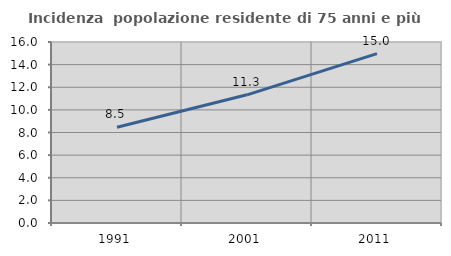
| Category | Incidenza  popolazione residente di 75 anni e più |
|---|---|
| 1991.0 | 8.46 |
| 2001.0 | 11.332 |
| 2011.0 | 14.975 |